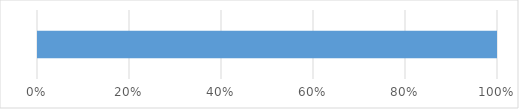
| Category | Series 0 | Series 1 | Series 2 | Series 3 | Series 4 |
|---|---|---|---|---|---|
| 0 | 0 | 0 | 0 | 0 | 8 |